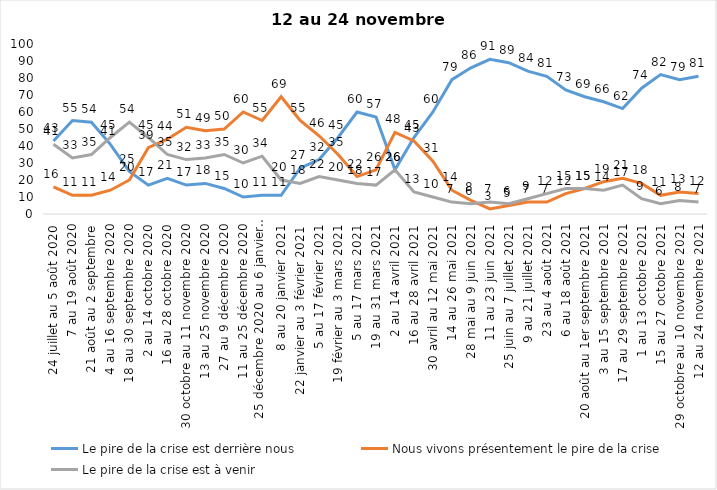
| Category | Le pire de la crise est derrière nous | Nous vivons présentement le pire de la crise | Le pire de la crise est à venir |
|---|---|---|---|
| 24 juillet au 5 août 2020 | 43 | 16 | 41 |
| 7 au 19 août 2020 | 55 | 11 | 33 |
| 21 août au 2 septembre | 54 | 11 | 35 |
| 4 au 16 septembre 2020 | 41 | 14 | 45 |
| 18 au 30 septembre 2020 | 25 | 20 | 54 |
| 2 au 14 octobre 2020 | 17 | 39 | 45 |
| 16 au 28 octobre 2020 | 21 | 44 | 35 |
| 30 octobre au 11 novembre 2020 | 17 | 51 | 32 |
| 13 au 25 novembre 2020 | 18 | 49 | 33 |
| 27 au 9 décembre 2020 | 15 | 50 | 35 |
| 11 au 25 décembre 2020 | 10 | 60 | 30 |
| 25 décembre 2020 au 6 janvier  2021 | 11 | 55 | 34 |
| 8 au 20 janvier 2021 | 11 | 69 | 20 |
| 22 janvier au 3 février 2021 | 27 | 55 | 18 |
| 5 au 17 février 2021 | 32 | 46 | 22 |
| 19 février au 3 mars 2021 | 45 | 35 | 20 |
| 5 au 17 mars 2021 | 60 | 22 | 18 |
| 19 au 31 mars 2021 | 57 | 26 | 17 |
| 2 au 14 avril 2021 | 26 | 48 | 26 |
| 16 au 28 avril 2021 | 45 | 43 | 13 |
| 30 avril au 12 mai 2021 | 60 | 31 | 10 |
| 14 au 26 mai 2021 | 79 | 14 | 7 |
| 28 mai au 9 juin 2021 | 86 | 8 | 6 |
| 11 au 23 juin 2021 | 91 | 3 | 7 |
| 25 juin au 7 juillet 2021 | 89 | 5 | 6 |
| 9 au 21 juillet 2021 | 84 | 7 | 9 |
| 23 au 4 août 2021 | 81 | 7 | 12 |
| 6 au 18 août 2021 | 73 | 12 | 15 |
| 20 août au 1er septembre 2021 | 69 | 15 | 15 |
| 3 au 15 septembre 2021 | 66 | 19 | 14 |
| 17 au 29 septembre 2021 | 62 | 21 | 17 |
| 1 au 13 octobre 2021 | 74 | 18 | 9 |
| 15 au 27 octobre 2021 | 82 | 11 | 6 |
| 29 octobre au 10 novembre 2021 | 79 | 13 | 8 |
| 12 au 24 novembre 2021 | 81 | 12 | 7 |